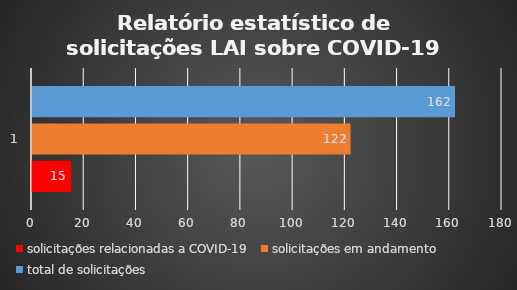
| Category | solicitações relacionadas a COVID-19 | solicitações em andamento | total de solicitações |
|---|---|---|---|
| 0 | 15 | 122 | 162 |